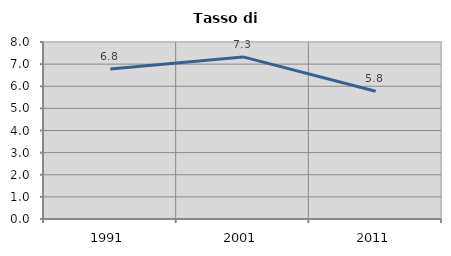
| Category | Tasso di disoccupazione   |
|---|---|
| 1991.0 | 6.78 |
| 2001.0 | 7.326 |
| 2011.0 | 5.775 |